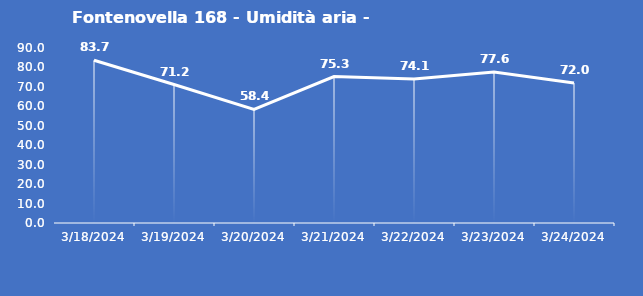
| Category | Fontenovella 168 - Umidità aria - Grezzo (%) |
|---|---|
| 3/18/24 | 83.7 |
| 3/19/24 | 71.2 |
| 3/20/24 | 58.4 |
| 3/21/24 | 75.3 |
| 3/22/24 | 74.1 |
| 3/23/24 | 77.6 |
| 3/24/24 | 72 |